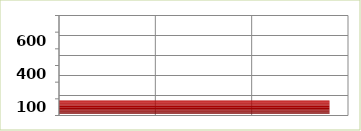
| Category | Series 0 |
|---|---|
| 100.0 | 1404000 |
| 200.0 | 0 |
| 400.0 | 0 |
| 500.0 | 0 |
| 600.0 | 0 |
| 700.0 | 0 |